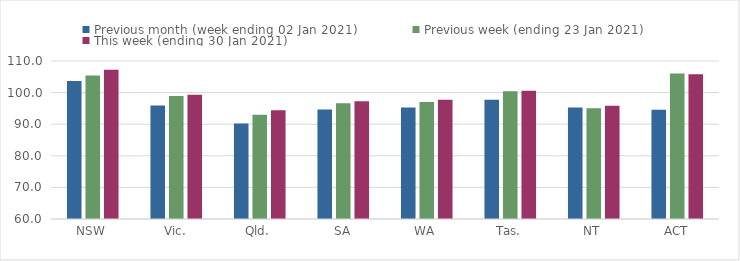
| Category | Previous month (week ending 02 Jan 2021) | Previous week (ending 23 Jan 2021) | This week (ending 30 Jan 2021) |
|---|---|---|---|
| NSW | 103.69 | 105.43 | 107.22 |
| Vic. | 95.93 | 98.93 | 99.34 |
| Qld. | 90.23 | 93.03 | 94.4 |
| SA | 94.62 | 96.61 | 97.23 |
| WA | 95.29 | 97.05 | 97.75 |
| Tas. | 97.77 | 100.44 | 100.59 |
| NT | 95.29 | 95.07 | 95.84 |
| ACT | 94.59 | 106.08 | 105.78 |